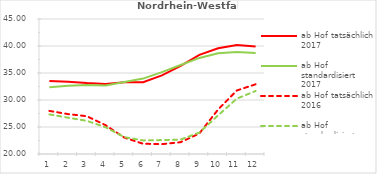
| Category | ab Hof tatsächlich 2017 | ab Hof standardisiert 2017 | ab Hof tatsächlich 2016 | ab Hof standardisiert 2016 |
|---|---|---|---|---|
| 0 | 33.523 | 32.345 | 27.98 | 27.331 |
| 1 | 33.4 | 32.624 | 27.387 | 26.722 |
| 2 | 33.136 | 32.79 | 26.997 | 26.141 |
| 3 | 32.962 | 32.672 | 25.328 | 24.946 |
| 4 | 33.305 | 33.335 | 23.033 | 23.122 |
| 5 | 33.276 | 33.964 | 21.899 | 22.515 |
| 6 | 34.561 | 35.159 | 21.823 | 22.577 |
| 7 | 36.319 | 36.486 | 22.188 | 22.672 |
| 8 | 38.362 | 37.792 | 23.802 | 23.968 |
| 9 | 39.577 | 38.661 | 28.242 | 27.159 |
| 10 | 40.205 | 38.91 | 31.77 | 30.258 |
| 11 | 39.908 | 38.709 | 32.91 | 31.668 |